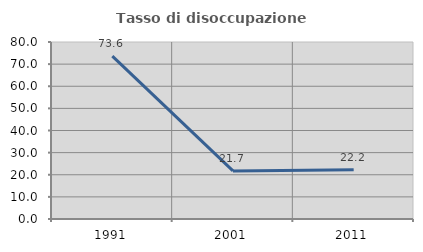
| Category | Tasso di disoccupazione giovanile  |
|---|---|
| 1991.0 | 73.585 |
| 2001.0 | 21.739 |
| 2011.0 | 22.222 |